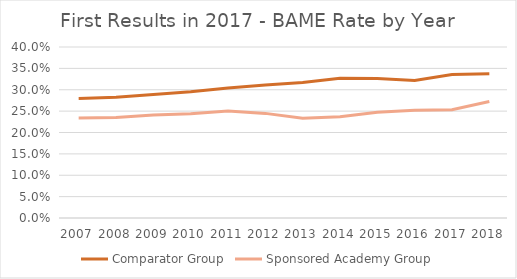
| Category | Comparator Group | Sponsored Academy Group |
|---|---|---|
| 2007.0 | 0.28 | 0.234 |
| 2008.0 | 0.282 | 0.235 |
| 2009.0 | 0.289 | 0.241 |
| 2010.0 | 0.295 | 0.244 |
| 2011.0 | 0.304 | 0.25 |
| 2012.0 | 0.311 | 0.245 |
| 2013.0 | 0.317 | 0.233 |
| 2014.0 | 0.327 | 0.237 |
| 2015.0 | 0.327 | 0.248 |
| 2016.0 | 0.321 | 0.252 |
| 2017.0 | 0.336 | 0.253 |
| 2018.0 | 0.338 | 0.273 |